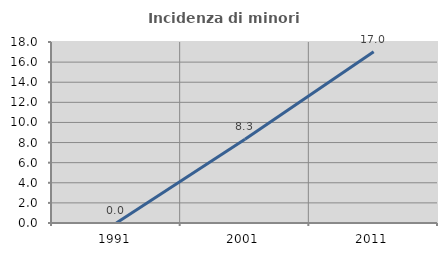
| Category | Incidenza di minori stranieri |
|---|---|
| 1991.0 | 0 |
| 2001.0 | 8.333 |
| 2011.0 | 17.021 |